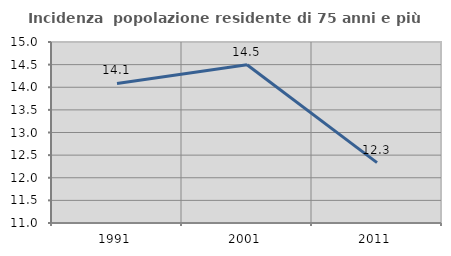
| Category | Incidenza  popolazione residente di 75 anni e più |
|---|---|
| 1991.0 | 14.085 |
| 2001.0 | 14.498 |
| 2011.0 | 12.334 |